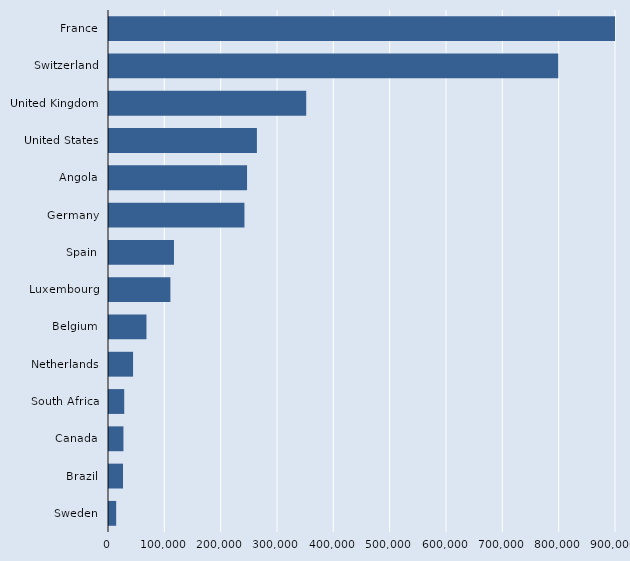
| Category | Series 2 |
|---|---|
| France | 1151040 |
| Switzerland | 797490 |
| United Kingdom | 350080 |
| United States | 262560 |
| Angola | 245080 |
| Germany | 240440 |
| Spain | 115330 |
| Luxembourg | 109010 |
| Belgium | 66500 |
| Netherlands | 42710 |
| South Africa | 27030 |
| Canada | 25610 |
| Brazil | 24820 |
| Sweden | 12730 |